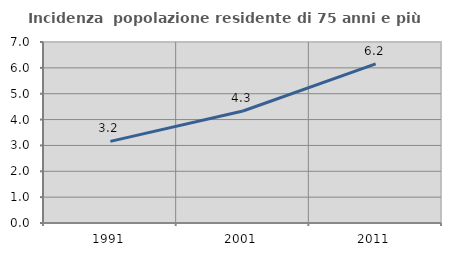
| Category | Incidenza  popolazione residente di 75 anni e più |
|---|---|
| 1991.0 | 3.157 |
| 2001.0 | 4.333 |
| 2011.0 | 6.152 |